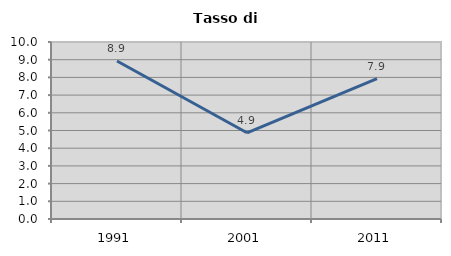
| Category | Tasso di disoccupazione   |
|---|---|
| 1991.0 | 8.929 |
| 2001.0 | 4.87 |
| 2011.0 | 7.93 |